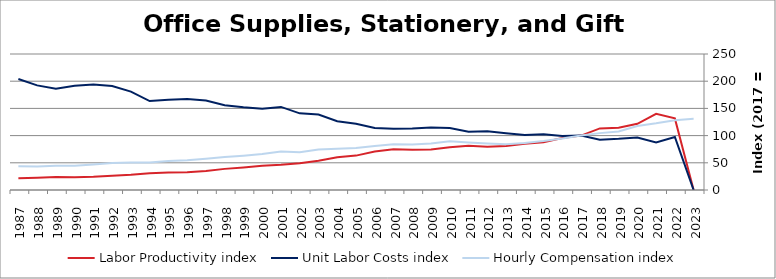
| Category | Labor Productivity index | Unit Labor Costs index | Hourly Compensation index |
|---|---|---|---|
| 2023.0 | 0 | 0 | 130.898 |
| 2022.0 | 131.637 | 97.452 | 128.283 |
| 2021.0 | 140.064 | 87.469 | 122.513 |
| 2020.0 | 121.677 | 96.636 | 117.584 |
| 2019.0 | 114.5 | 94.032 | 107.667 |
| 2018.0 | 113.265 | 92.31 | 104.555 |
| 2017.0 | 100 | 100 | 100 |
| 2016.0 | 95.387 | 99.451 | 94.863 |
| 2015.0 | 87.723 | 102.544 | 89.955 |
| 2014.0 | 85.18 | 101.326 | 86.309 |
| 2013.0 | 80.832 | 104.241 | 84.26 |
| 2012.0 | 79.314 | 107.897 | 85.578 |
| 2011.0 | 81.408 | 107.286 | 87.34 |
| 2010.0 | 78.515 | 114.044 | 89.541 |
| 2009.0 | 74.476 | 114.9 | 85.573 |
| 2008.0 | 74.041 | 113.164 | 83.788 |
| 2007.0 | 74.733 | 112.728 | 84.245 |
| 2006.0 | 70.94 | 114.17 | 80.993 |
| 2005.0 | 63.214 | 121.902 | 77.059 |
| 2004.0 | 60.124 | 126.421 | 76.009 |
| 2003.0 | 53.778 | 138.592 | 74.533 |
| 2002.0 | 49.362 | 140.889 | 69.545 |
| 2001.0 | 46.437 | 152.727 | 70.921 |
| 2000.0 | 44.388 | 149.14 | 66.2 |
| 1999.0 | 41.519 | 152.057 | 63.133 |
| 1998.0 | 38.832 | 155.881 | 60.532 |
| 1997.0 | 34.914 | 164.337 | 57.377 |
| 1996.0 | 32.709 | 167.072 | 54.647 |
| 1995.0 | 32.019 | 165.886 | 53.115 |
| 1994.0 | 30.993 | 163.421 | 50.649 |
| 1993.0 | 27.885 | 180.802 | 50.416 |
| 1992.0 | 26.031 | 190.981 | 49.715 |
| 1991.0 | 24.248 | 194.079 | 47.061 |
| 1990.0 | 23.248 | 191.675 | 44.561 |
| 1989.0 | 23.825 | 186.255 | 44.376 |
| 1988.0 | 22.415 | 192.292 | 43.102 |
| 1987.0 | 21.41 | 203.939 | 43.664 |